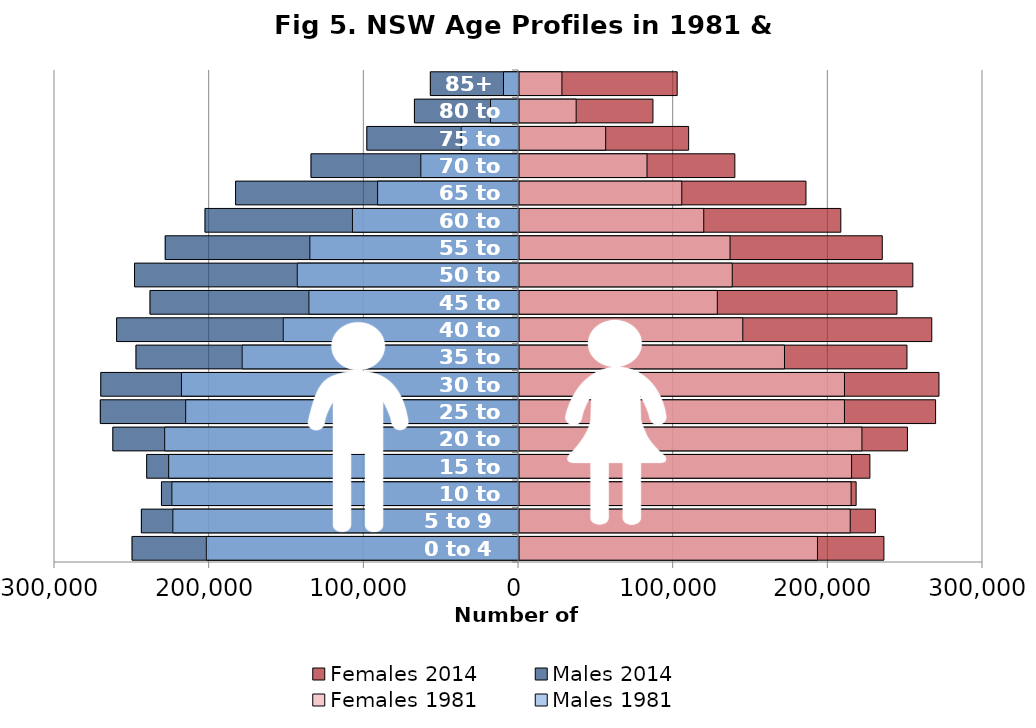
| Category | Females 2014 | Males 2014 | Females 1981 | Males 1981 |
|---|---|---|---|---|
| 0 to 4 | 235940 | -249853 | 192981 | -201867 |
| 5 to 9 | 230438 | -243830 | 214141 | -223479 |
| 10 to 14 | 217970 | -230847 | 214716 | -224114 |
| 15 to 19 | 226873 | -240402 | 215032 | -226185 |
| 20 to 24 | 251146 | -262279 | 221717 | -228767 |
| 25 to 29 | 269354 | -270376 | 210420 | -215184 |
| 30 to 34 | 271537 | -270086 | 210438 | -217927 |
| 35 to 39 | 250846 | -247309 | 171652 | -178692 |
| 40 to 44 | 266884 | -259824 | 144691 | -152137 |
| 45 to 49 | 244384 | -238253 | 128219 | -135514 |
| 50 to 54 | 254641 | -248267 | 137880 | -143064 |
| 55 to 59 | 234884 | -228414 | 136447 | -134907 |
| 60 to 64 | 208074 | -202675 | 119446 | -107362 |
| 65 to 69 | 185549 | -182929 | 105255 | -91091 |
| 70 to 74 | 139562 | -134149 | 82764 | -63168 |
| 75 to 79 | 109678 | -98062 | 56040 | -37083 |
| 80 to 84 | 86613 | -67285 | 36945 | -18095 |
| 85+ | 102267 | -56992 | 27754 | -9715 |